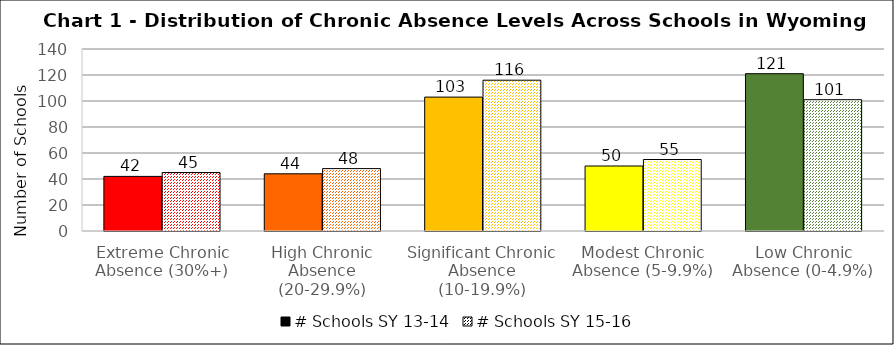
| Category | # Schools SY 13-14 | # Schools SY 15-16 |
|---|---|---|
| Extreme Chronic Absence (30%+) | 42 | 45 |
| High Chronic Absence (20-29.9%) | 44 | 48 |
| Significant Chronic Absence (10-19.9%) | 103 | 116 |
| Modest Chronic Absence (5-9.9%) | 50 | 55 |
| Low Chronic Absence (0-4.9%) | 121 | 101 |